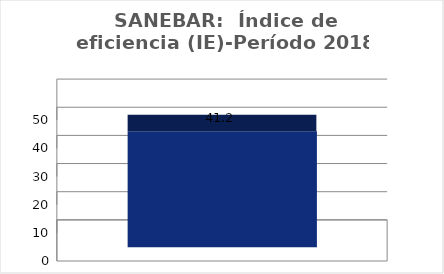
| Category | Índice de eficiencia (IE)  |
|---|---|
| 0 | 41.183 |